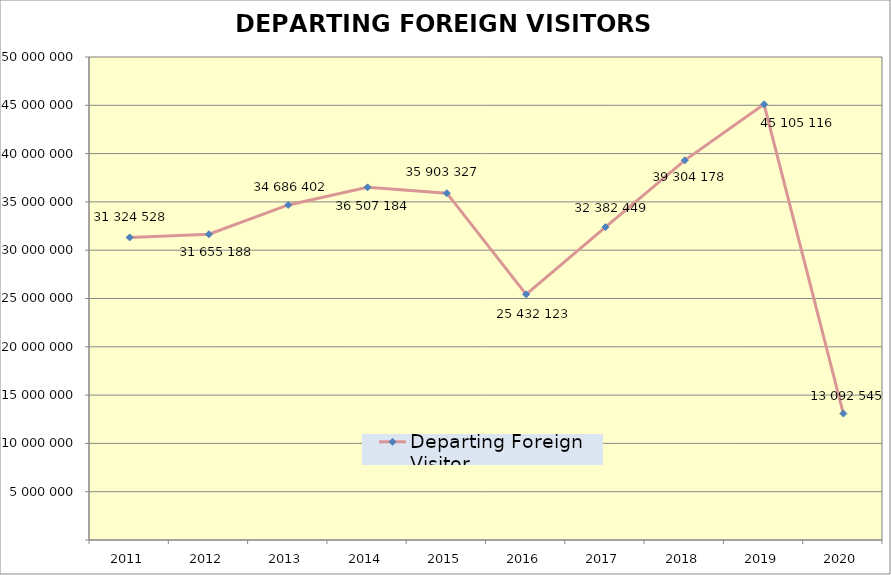
| Category | Departing Foreign Visitor |
|---|---|
| 2011.0 | 31324528 |
| 2012.0 | 31655188 |
| 2013.0 | 34686402 |
| 2014.0 | 36507184 |
| 2015.0 | 35903327 |
| 2016.0 | 25432123 |
| 2017.0 | 32382449 |
| 2018.0 | 39304178 |
| 2019.0 | 45105116 |
| 2020.0 | 13092545 |